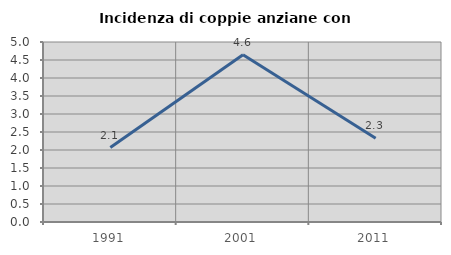
| Category | Incidenza di coppie anziane con figli |
|---|---|
| 1991.0 | 2.069 |
| 2001.0 | 4.645 |
| 2011.0 | 2.326 |